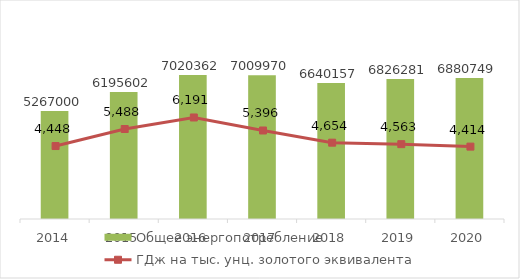
| Category | Общее энергопотребление |
|---|---|
| 2014.0 | 5267000 |
| 2015.0 | 6195602 |
| 2016.0 | 7020362 |
| 2017.0 | 7009970 |
| 2018.0 | 6640157 |
| 2019.0 | 6826280.604 |
| 2020.0 | 6880748.728 |